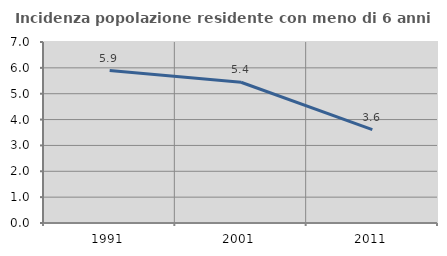
| Category | Incidenza popolazione residente con meno di 6 anni |
|---|---|
| 1991.0 | 5.897 |
| 2001.0 | 5.443 |
| 2011.0 | 3.612 |